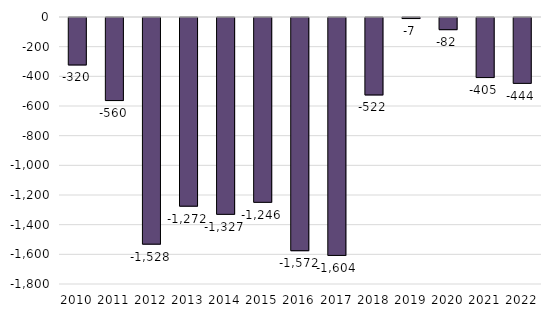
| Category | Firefighters |
|---|---|
| 2010 | -320 |
| 2011 | -560 |
| 2012 | -1528 |
| 2013 | -1272 |
| 2014 | -1327 |
| 2015 | -1246 |
| 2016 | -1572 |
| 2017 | -1604 |
| 2018 | -522 |
| 2019 | -7 |
| 2020 | -82 |
| 2021 | -405 |
| 2022 | -444 |